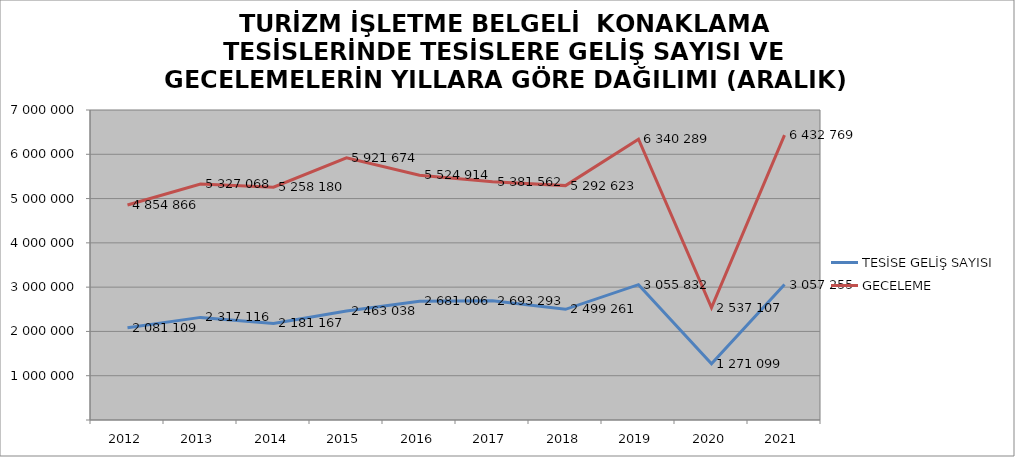
| Category | TESİSE GELİŞ SAYISI | GECELEME |
|---|---|---|
| 2012 | 2081109 | 4854866 |
| 2013 | 2317116 | 5327068 |
| 2014 | 2181167 | 5258180 |
| 2015 | 2463038 | 5921674 |
| 2016 | 2681006 | 5524914 |
| 2017 | 2693293 | 5381562 |
| 2018 | 2499261 | 5292623 |
| 2019 | 3055832 | 6340289 |
| 2020 | 1271099 | 2537107 |
| 2021 | 3057255 | 6432769 |